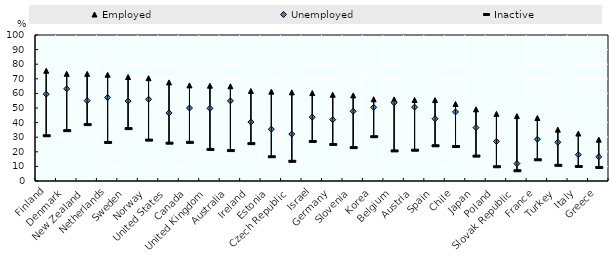
| Category | Employed | Unemployed | Inactive |
|---|---|---|---|
| Finland | 75.511 | 59.429 | 30.991 |
| Denmark | 73.451 | 63.121 | 34.496 |
| New Zealand | 73.375 | 55.007 | 38.622 |
| Netherlands | 72.749 | 57.211 | 26.409 |
| Sweden | 71.23 | 54.73 | 35.87 |
| Norway | 70.41 | 55.977 | 28 |
| United States | 67.534 | 46.611 | 25.915 |
| Canada | 65.484 | 50.002 | 26.46 |
| United Kingdom | 65.255 | 49.756 | 21.618 |
| Australia | 64.871 | 54.88 | 20.829 |
| Ireland | 61.661 | 40.378 | 25.597 |
| Estonia | 61.192 | 35.498 | 16.603 |
| Czech Republic | 60.714 | 32.147 | 13.494 |
| Israel | 60.21 | 43.722 | 27.087 |
| Germany | 59.067 | 42.01 | 25.026 |
| Slovenia | 58.64 | 47.767 | 22.868 |
| Korea | 55.979 | 50.468 | 30.33 |
| Belgium | 55.892 | 53.593 | 20.621 |
| Austria | 55.468 | 50.593 | 21.081 |
| Spain | 55.433 | 42.635 | 24.128 |
| Chile | 52.771 | 47.322 | 23.637 |
| Japan | 49.104 | 36.589 | 17.051 |
| Poland | 45.98 | 27.135 | 9.764 |
| Slovak Republic | 44.467 | 11.92 | 7.026 |
| France | 43.172 | 28.623 | 14.527 |
| Turkey | 35.186 | 26.493 | 10.727 |
| Italy | 32.489 | 18.041 | 9.941 |
| Greece | 28.323 | 16.548 | 9.269 |